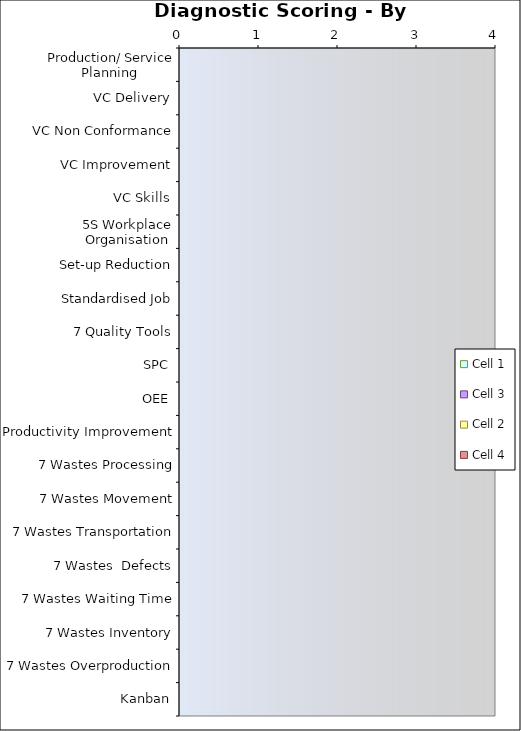
| Category | Cell 1 | Cell 3 | Cell 2 | Cell 4 |
|---|---|---|---|---|
| Production/ Service Planning | 0 | 0 | 0 | 0 |
| VC Delivery | 0 | 0 | 0 | 0 |
| VC Non Conformance | 0 | 0 | 0 | 0 |
| VC Improvement | 0 | 0 | 0 | 0 |
| VC Skills | 0 | 0 | 0 | 0 |
| 5S Workplace Organisation | 0 | 0 | 0 | 0 |
| Set-up Reduction | 0 | 0 | 0 | 0 |
| Standardised Job | 0 | 0 | 0 | 0 |
| 7 Quality Tools | 0 | 0 | 0 | 0 |
| SPC | 0 | 0 | 0 | 0 |
| OEE | 0 | 0 | 0 | 0 |
| Productivity Improvement | 0 | 0 | 0 | 0 |
| 7 Wastes Processing | 0 | 0 | 0 | 0 |
| 7 Wastes Movement | 0 | 0 | 0 | 0 |
| 7 Wastes Transportation | 0 | 0 | 0 | 0 |
| 7 Wastes  Defects | 0 | 0 | 0 | 0 |
| 7 Wastes Waiting Time | 0 | 0 | 0 | 0 |
| 7 Wastes Inventory | 0 | 0 | 0 | 0 |
| 7 Wastes Overproduction | 0 | 0 | 0 | 0 |
| Kanban | 0 | 0 | 0 | 0 |